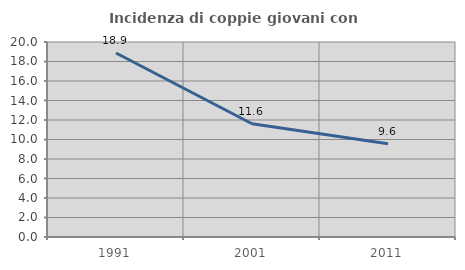
| Category | Incidenza di coppie giovani con figli |
|---|---|
| 1991.0 | 18.868 |
| 2001.0 | 11.618 |
| 2011.0 | 9.574 |